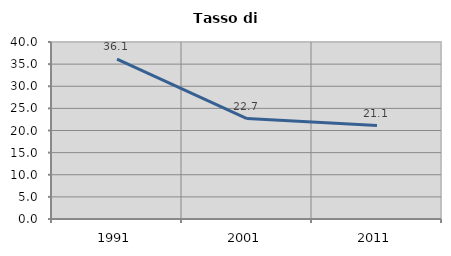
| Category | Tasso di disoccupazione   |
|---|---|
| 1991.0 | 36.136 |
| 2001.0 | 22.709 |
| 2011.0 | 21.122 |